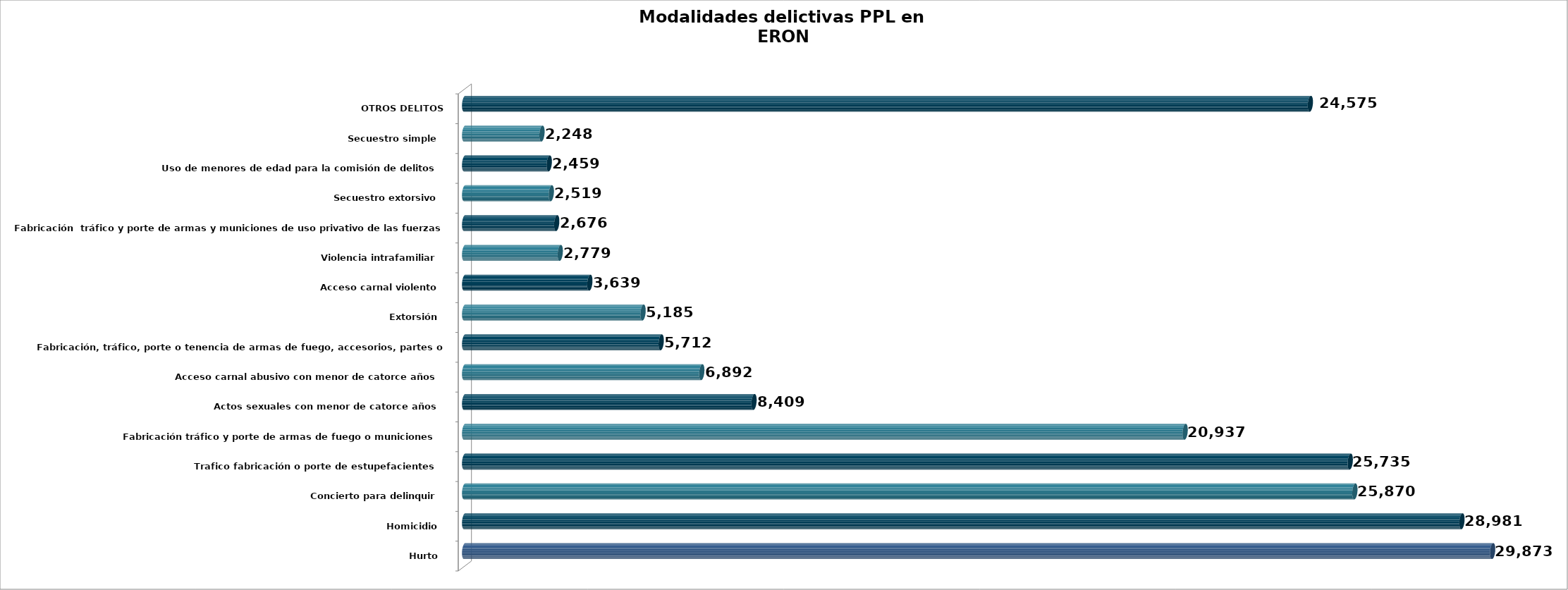
| Category | Series 0 |
|---|---|
| Hurto   | 29873 |
| Homicidio   | 28981 |
| Concierto para delinquir   | 25870 |
| Trafico fabricación o porte de estupefacientes   | 25735 |
| Fabricación tráfico y porte de armas de fuego o municiones   | 20937 |
| Actos sexuales con menor de catorce años   | 8409 |
| Acceso carnal abusivo con menor de catorce años   | 6892 |
| Fabricación, tráfico, porte o tenencia de armas de fuego, accesorios, partes o municiones   | 5712 |
| Extorsión   | 5185 |
| Acceso carnal violento   | 3639 |
| Violencia intrafamiliar   | 2779 |
| Fabricación  tráfico y porte de armas y municiones de uso privativo de las fuerzas armadas   | 2676 |
| Secuestro extorsivo   | 2519 |
| Uso de menores de edad para la comisión de delitos   | 2459 |
| Secuestro simple   | 2248 |
| OTROS DELITOS | 24575 |